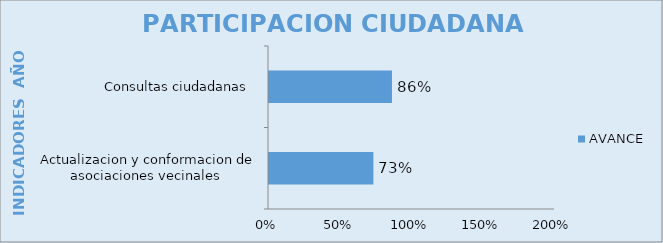
| Category | AVANCE |
|---|---|
| Actualizacion y conformacion de asociaciones vecinales  | 0.73 |
| Consultas ciudadanas  | 0.86 |